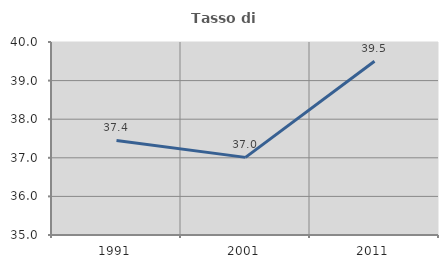
| Category | Tasso di occupazione   |
|---|---|
| 1991.0 | 37.449 |
| 2001.0 | 37.011 |
| 2011.0 | 39.503 |